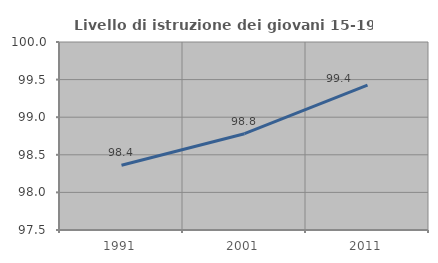
| Category | Livello di istruzione dei giovani 15-19 anni |
|---|---|
| 1991.0 | 98.361 |
| 2001.0 | 98.78 |
| 2011.0 | 99.425 |